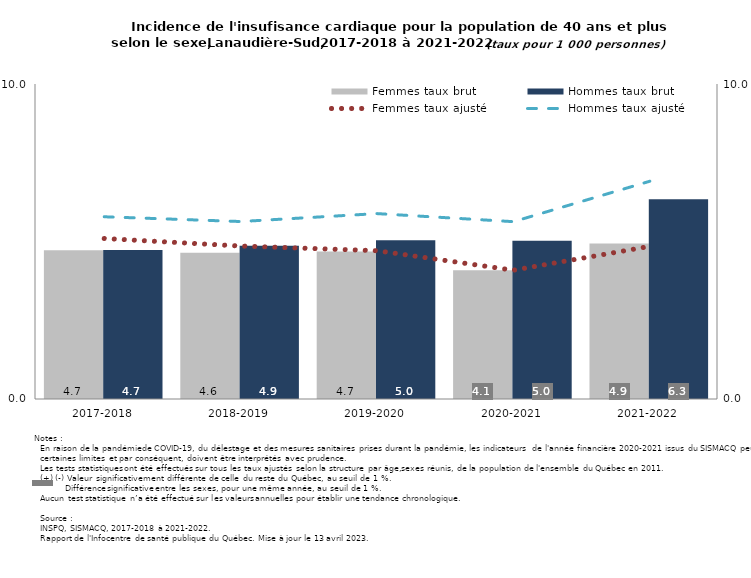
| Category | Femmes taux brut | Hommes taux brut |
|---|---|---|
| 2017-2018 | 4.725 | 4.732 |
| 2018-2019 | 4.645 | 4.862 |
| 2019-2020 | 4.679 | 5.043 |
| 2020-2021 | 4.084 | 5.021 |
| 2021-2022 | 4.937 | 6.338 |